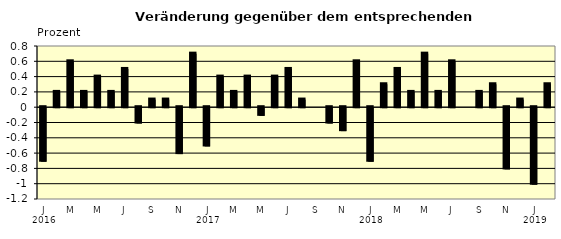
| Category | Series 0 |
|---|---|
| 0 | -0.7 |
| 1 | 0.2 |
| 2 | 0.6 |
| 3 | 0.2 |
| 4 | 0.4 |
| 5 | 0.2 |
| 6 | 0.5 |
| 7 | -0.2 |
| 8 | 0.1 |
| 9 | 0.1 |
| 10 | -0.6 |
| 11 | 0.7 |
| 12 | -0.5 |
| 13 | 0.4 |
| 14 | 0.2 |
| 15 | 0.4 |
| 16 | -0.1 |
| 17 | 0.4 |
| 18 | 0.5 |
| 19 | 0.1 |
| 20 | 0 |
| 21 | -0.2 |
| 22 | -0.3 |
| 23 | 0.6 |
| 24 | -0.7 |
| 25 | 0.3 |
| 26 | 0.5 |
| 27 | 0.2 |
| 28 | 0.7 |
| 29 | 0.2 |
| 30 | 0.6 |
| 31 | 0 |
| 32 | 0.2 |
| 33 | 0.3 |
| 34 | -0.8 |
| 35 | 0.1 |
| 36 | -1 |
| 37 | 0.3 |